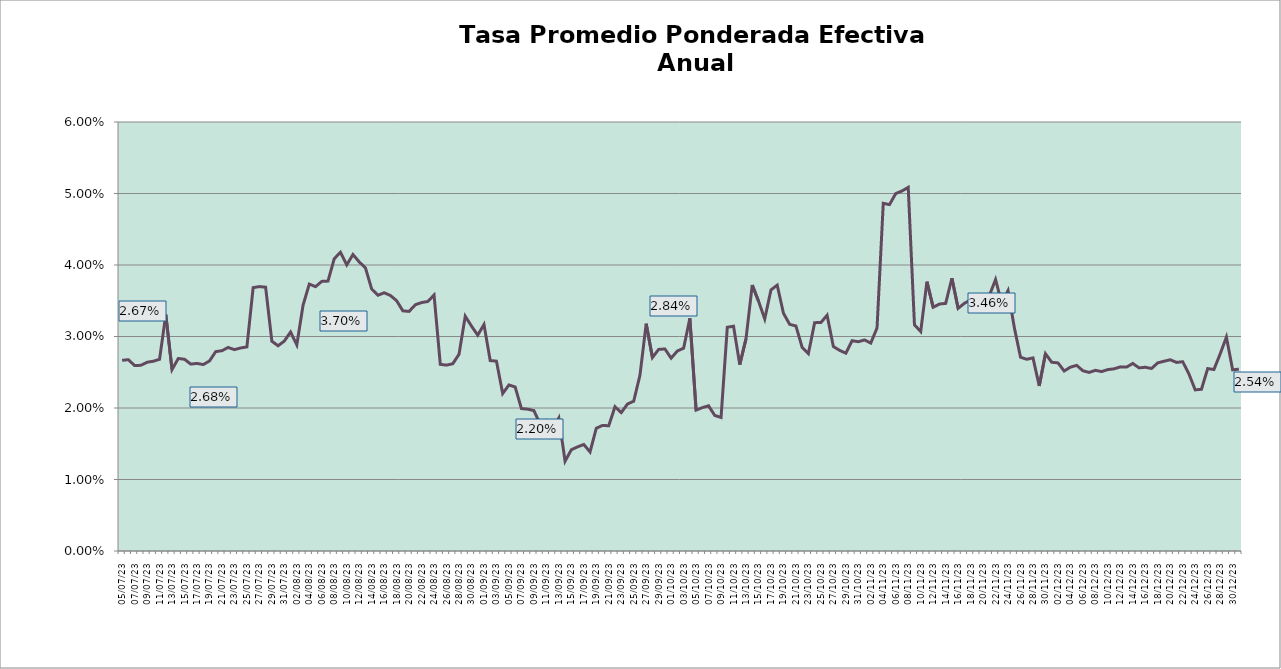
| Category | TEA |
|---|---|
| 2023-07-05 | 0.027 |
| 2023-07-06 | 0.027 |
| 2023-07-07 | 0.026 |
| 2023-07-08 | 0.026 |
| 2023-07-09 | 0.026 |
| 2023-07-10 | 0.027 |
| 2023-07-11 | 0.027 |
| 2023-07-12 | 0.033 |
| 2023-07-13 | 0.025 |
| 2023-07-14 | 0.027 |
| 2023-07-15 | 0.027 |
| 2023-07-16 | 0.026 |
| 2023-07-17 | 0.026 |
| 2023-07-18 | 0.026 |
| 2023-07-19 | 0.027 |
| 2023-07-20 | 0.028 |
| 2023-07-21 | 0.028 |
| 2023-07-22 | 0.028 |
| 2023-07-23 | 0.028 |
| 2023-07-24 | 0.028 |
| 2023-07-25 | 0.029 |
| 2023-07-26 | 0.037 |
| 2023-07-27 | 0.037 |
| 2023-07-28 | 0.037 |
| 2023-07-29 | 0.029 |
| 2023-07-30 | 0.029 |
| 2023-07-31 | 0.029 |
| 2023-08-01 | 0.031 |
| 2023-08-02 | 0.029 |
| 2023-08-03 | 0.034 |
| 2023-08-04 | 0.037 |
| 2023-08-05 | 0.037 |
| 2023-08-06 | 0.038 |
| 2023-08-07 | 0.038 |
| 2023-08-08 | 0.041 |
| 2023-08-09 | 0.042 |
| 2023-08-10 | 0.04 |
| 2023-08-11 | 0.041 |
| 2023-08-12 | 0.04 |
| 2023-08-13 | 0.04 |
| 2023-08-14 | 0.037 |
| 2023-08-15 | 0.036 |
| 2023-08-16 | 0.036 |
| 2023-08-17 | 0.036 |
| 2023-08-18 | 0.035 |
| 2023-08-19 | 0.034 |
| 2023-08-20 | 0.034 |
| 2023-08-21 | 0.034 |
| 2023-08-22 | 0.035 |
| 2023-08-23 | 0.035 |
| 2023-08-24 | 0.036 |
| 2023-08-25 | 0.026 |
| 2023-08-26 | 0.026 |
| 2023-08-27 | 0.026 |
| 2023-08-28 | 0.028 |
| 2023-08-29 | 0.033 |
| 2023-08-30 | 0.031 |
| 2023-08-31 | 0.03 |
| 2023-09-01 | 0.032 |
| 2023-09-02 | 0.027 |
| 2023-09-03 | 0.027 |
| 2023-09-04 | 0.022 |
| 2023-09-05 | 0.023 |
| 2023-09-06 | 0.023 |
| 2023-09-07 | 0.02 |
| 2023-09-08 | 0.02 |
| 2023-09-09 | 0.02 |
| 2023-09-10 | 0.018 |
| 2023-09-11 | 0.018 |
| 2023-09-12 | 0.017 |
| 2023-09-13 | 0.019 |
| 2023-09-14 | 0.013 |
| 2023-09-15 | 0.014 |
| 2023-09-16 | 0.015 |
| 2023-09-17 | 0.015 |
| 2023-09-18 | 0.014 |
| 2023-09-19 | 0.017 |
| 2023-09-20 | 0.018 |
| 2023-09-21 | 0.018 |
| 2023-09-22 | 0.02 |
| 2023-09-23 | 0.019 |
| 2023-09-24 | 0.021 |
| 2023-09-25 | 0.021 |
| 2023-09-26 | 0.025 |
| 2023-09-27 | 0.032 |
| 2023-09-28 | 0.027 |
| 2023-09-29 | 0.028 |
| 2023-09-30 | 0.028 |
| 2023-10-01 | 0.027 |
| 2023-10-02 | 0.028 |
| 2023-10-03 | 0.028 |
| 2023-10-04 | 0.033 |
| 2023-10-05 | 0.02 |
| 2023-10-06 | 0.02 |
| 2023-10-07 | 0.02 |
| 2023-10-08 | 0.019 |
| 2023-10-09 | 0.019 |
| 2023-10-10 | 0.031 |
| 2023-10-11 | 0.031 |
| 2023-10-12 | 0.026 |
| 2023-10-13 | 0.03 |
| 2023-10-14 | 0.037 |
| 2023-10-15 | 0.035 |
| 2023-10-16 | 0.032 |
| 2023-10-17 | 0.037 |
| 2023-10-18 | 0.037 |
| 2023-10-19 | 0.033 |
| 2023-10-20 | 0.032 |
| 2023-10-21 | 0.031 |
| 2023-10-22 | 0.028 |
| 2023-10-23 | 0.028 |
| 2023-10-24 | 0.032 |
| 2023-10-25 | 0.032 |
| 2023-10-26 | 0.033 |
| 2023-10-27 | 0.029 |
| 2023-10-28 | 0.028 |
| 2023-10-29 | 0.028 |
| 2023-10-30 | 0.029 |
| 2023-10-31 | 0.029 |
| 2023-11-01 | 0.03 |
| 2023-11-02 | 0.029 |
| 2023-11-03 | 0.031 |
| 2023-11-04 | 0.049 |
| 2023-11-05 | 0.048 |
| 2023-11-06 | 0.05 |
| 2023-11-07 | 0.05 |
| 2023-11-08 | 0.051 |
| 2023-11-09 | 0.032 |
| 2023-11-10 | 0.031 |
| 2023-11-11 | 0.038 |
| 2023-11-12 | 0.034 |
| 2023-11-13 | 0.035 |
| 2023-11-14 | 0.035 |
| 2023-11-15 | 0.038 |
| 2023-11-16 | 0.034 |
| 2023-11-17 | 0.035 |
| 2023-11-18 | 0.035 |
| 2023-11-19 | 0.035 |
| 2023-11-20 | 0.035 |
| 2023-11-21 | 0.036 |
| 2023-11-22 | 0.038 |
| 2023-11-23 | 0.035 |
| 2023-11-24 | 0.036 |
| 2023-11-25 | 0.031 |
| 2023-11-26 | 0.027 |
| 2023-11-27 | 0.027 |
| 2023-11-28 | 0.027 |
| 2023-11-29 | 0.023 |
| 2023-11-30 | 0.028 |
| 2023-12-01 | 0.026 |
| 2023-12-02 | 0.026 |
| 2023-12-03 | 0.025 |
| 2023-12-04 | 0.026 |
| 2023-12-05 | 0.026 |
| 2023-12-06 | 0.025 |
| 2023-12-07 | 0.025 |
| 2023-12-08 | 0.025 |
| 2023-12-09 | 0.025 |
| 2023-12-10 | 0.025 |
| 2023-12-11 | 0.025 |
| 2023-12-12 | 0.026 |
| 2023-12-13 | 0.026 |
| 2023-12-14 | 0.026 |
| 2023-12-15 | 0.026 |
| 2023-12-16 | 0.026 |
| 2023-12-17 | 0.026 |
| 2023-12-18 | 0.026 |
| 2023-12-19 | 0.027 |
| 2023-12-20 | 0.027 |
| 2023-12-21 | 0.026 |
| 2023-12-22 | 0.026 |
| 2023-12-23 | 0.025 |
| 2023-12-24 | 0.023 |
| 2023-12-25 | 0.023 |
| 2023-12-26 | 0.026 |
| 2023-12-27 | 0.025 |
| 2023-12-28 | 0.028 |
| 2023-12-29 | 0.03 |
| 2023-12-30 | 0.025 |
| 2023-12-31 | 0.025 |